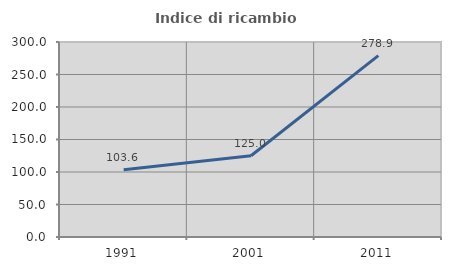
| Category | Indice di ricambio occupazionale  |
|---|---|
| 1991.0 | 103.571 |
| 2001.0 | 125 |
| 2011.0 | 278.947 |